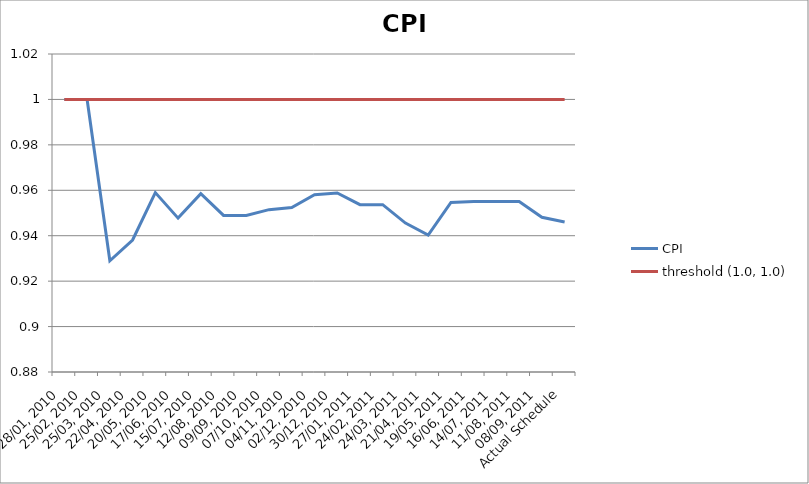
| Category | CPI | threshold (1.0, 1.0) |
|---|---|---|
| 28/01, 2010 | 1 | 1 |
| 25/02, 2010 | 1 | 1 |
| 25/03, 2010 | 0.929 | 1 |
| 22/04, 2010 | 0.938 | 1 |
| 20/05, 2010 | 0.959 | 1 |
| 17/06, 2010 | 0.948 | 1 |
| 15/07, 2010 | 0.959 | 1 |
| 12/08, 2010 | 0.949 | 1 |
| 09/09, 2010 | 0.949 | 1 |
| 07/10, 2010 | 0.951 | 1 |
| 04/11, 2010 | 0.952 | 1 |
| 02/12, 2010 | 0.958 | 1 |
| 30/12, 2010 | 0.959 | 1 |
| 27/01, 2011 | 0.954 | 1 |
| 24/02, 2011 | 0.954 | 1 |
| 24/03, 2011 | 0.946 | 1 |
| 21/04, 2011 | 0.94 | 1 |
| 19/05, 2011 | 0.955 | 1 |
| 16/06, 2011 | 0.955 | 1 |
| 14/07, 2011 | 0.955 | 1 |
| 11/08, 2011 | 0.955 | 1 |
| 08/09, 2011 | 0.948 | 1 |
| Actual Schedule | 0.946 | 1 |